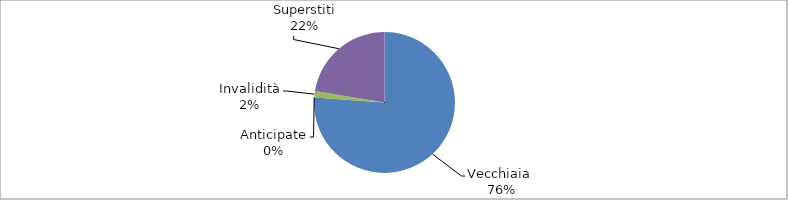
| Category | Series 0 |
|---|---|
| Vecchiaia  | 32309 |
| Anticipate | 0 |
| Invalidità | 617 |
| Superstiti | 9499 |